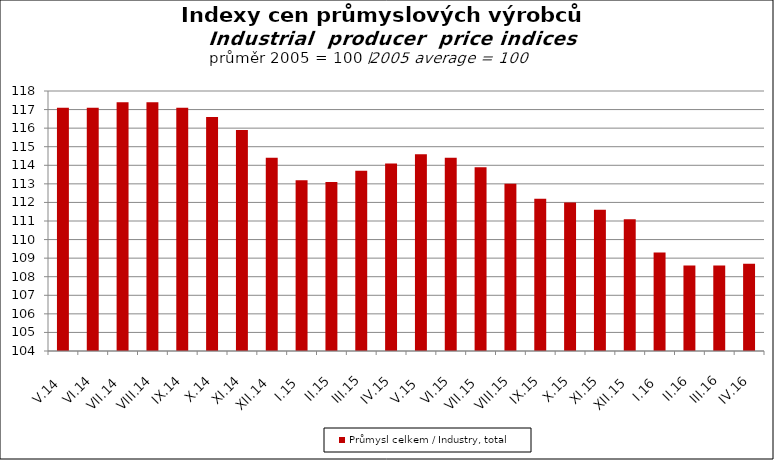
| Category | Průmysl celkem / Industry, total |
|---|---|
| V.14 | 117.1 |
| VI.14 | 117.1 |
| VII.14 | 117.4 |
| VIII.14 | 117.4 |
| IX.14 | 117.1 |
| X.14 | 116.6 |
| XI.14 | 115.9 |
| XII.14 | 114.4 |
| I.15 | 113.2 |
| II.15 | 113.1 |
| III.15 | 113.7 |
| IV.15 | 114.1 |
| V.15 | 114.6 |
| VI.15 | 114.4 |
| VII.15 | 113.9 |
| VIII.15 | 113 |
| IX.15 | 112.2 |
| X.15 | 112 |
| XI.15 | 111.6 |
| XII.15 | 111.1 |
| I.16 | 109.3 |
| II.16 | 108.6 |
| III.16 | 108.6 |
| IV.16 | 108.7 |